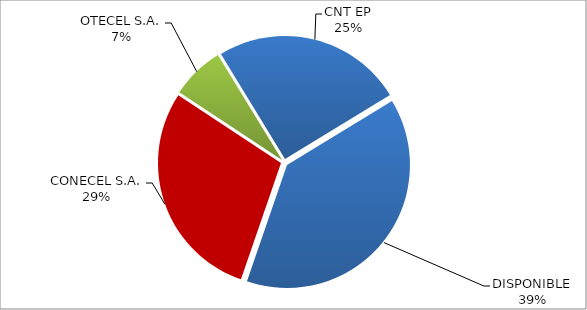
| Category | CÓDIGO DE RED 96 |
|---|---|
| CONECEL S.A. | 0.29 |
| OTECEL S.A. | 0.07 |
| CNT EP | 0.25 |
| DISPONIBLE | 0.39 |